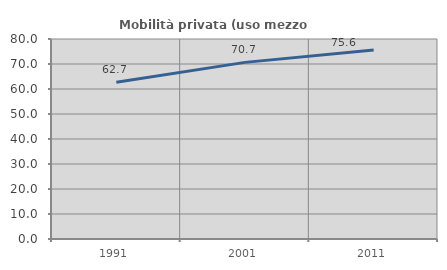
| Category | Mobilità privata (uso mezzo privato) |
|---|---|
| 1991.0 | 62.663 |
| 2001.0 | 70.651 |
| 2011.0 | 75.626 |